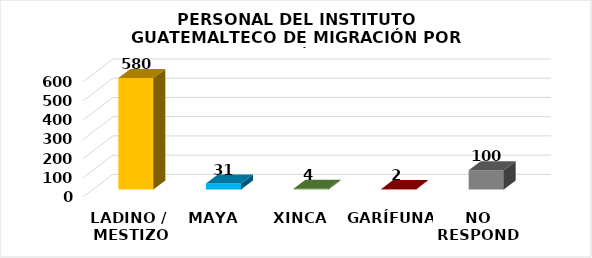
| Category | Series 0 |
|---|---|
| LADINO /
 MESTIZO | 580 |
| MAYA | 31 |
| XINCA | 4 |
| GARÍFUNA | 2 |
| NO RESPONDE | 100 |